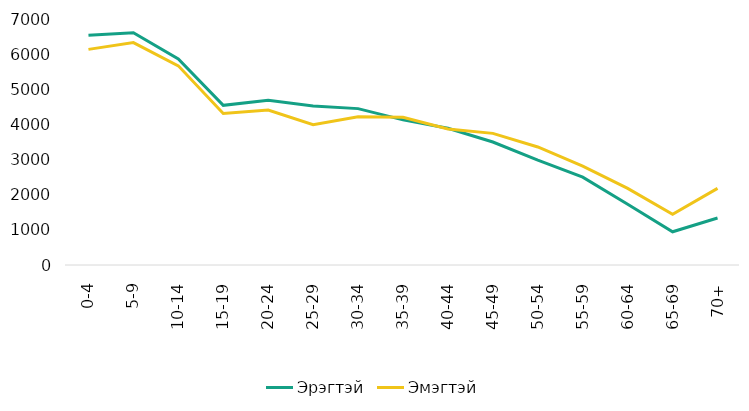
| Category | Эрэгтэй | Эмэгтэй |
|---|---|---|
| 0-4 | 6537 | 6136 |
|           5-9 | 6610 | 6329 |
|        10-14 | 5865 | 5667 |
|        15-19 | 4543 | 4310 |
|        20-24 | 4686 | 4409 |
|        25-29 | 4526 | 3994 |
|        30-34 | 4450 | 4218 |
|        35-39 | 4130 | 4203 |
|        40-44 | 3890 | 3869 |
|        45-49 | 3500 | 3746 |
|        50-54 | 2982 | 3359 |
|        55-59 | 2498 | 2816 |
|        60-64 | 1727 | 2181 |
|        65-69 | 945 | 1445 |
|          70+ | 1338 | 2180 |